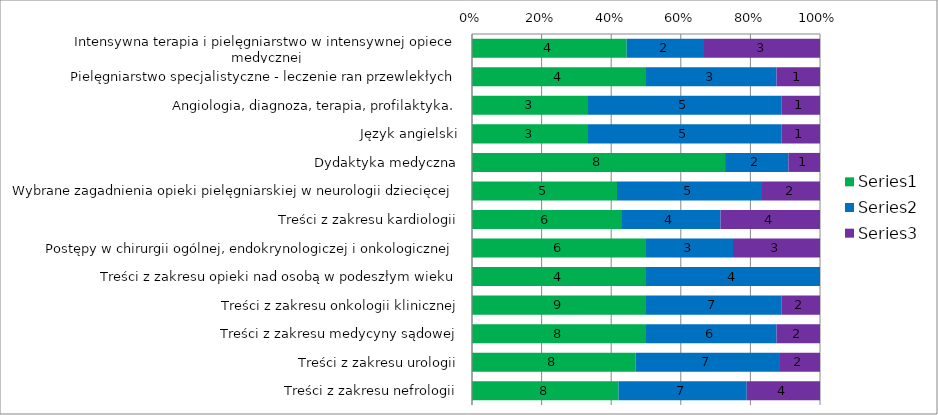
| Category | Series 0 | Series 1 | Series 2 |
|---|---|---|---|
| Intensywna terapia i pielęgniarstwo w intensywnej opiece medycznej | 4 | 2 | 3 |
| Pielęgniarstwo specjalistyczne - leczenie ran przewlekłych | 4 | 3 | 1 |
| Angiologia, diagnoza, terapia, profilaktyka. | 3 | 5 | 1 |
| Język angielski | 3 | 5 | 1 |
| Dydaktyka medyczna | 8 | 2 | 1 |
| Wybrane zagadnienia opieki pielęgniarskiej w neurologii dziecięcej | 5 | 5 | 2 |
| Treści z zakresu kardiologii | 6 | 4 | 4 |
| Postępy w chirurgii ogólnej, endokrynologiczej i onkologicznej | 6 | 3 | 3 |
| Treści z zakresu opieki nad osobą w podeszłym wieku | 4 | 4 | 0 |
| Treści z zakresu onkologii klinicznej | 9 | 7 | 2 |
| Treści z zakresu medycyny sądowej | 8 | 6 | 2 |
| Treści z zakresu urologii | 8 | 7 | 2 |
| Treści z zakresu nefrologii | 8 | 7 | 4 |